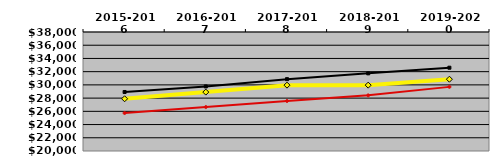
| Category | Series 0 | Series 1 | Series 2 |
|---|---|---|---|
| 2015-2016 | 28924.5 | 25742 | 27900 |
| 2016-2017 | 29767 | 26650 | 28910 |
| 2017-2018 | 30869 | 27566 | 29960 |
| 2018-2019 | 31745 | 28415 | 29960 |
| 2019-2020 | 32598 | 29700 | 30860 |